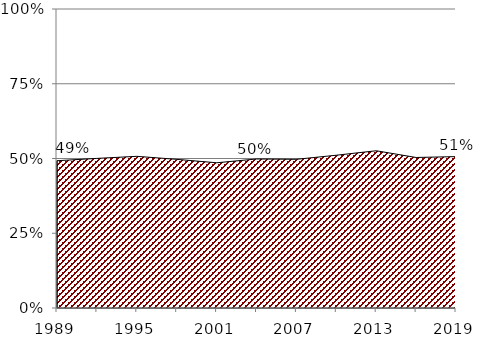
| Category | All workers, aged 25-64 |
|---|---|
| 1989.0 | 0.493 |
| 1992.0 | 0.5 |
| 1995.0 | 0.507 |
| 1998.0 | 0.497 |
| 2001.0 | 0.486 |
| 2004.0 | 0.498 |
| 2007.0 | 0.497 |
| 2010.0 | 0.511 |
| 2013.0 | 0.526 |
| 2016.0 | 0.503 |
| 2019.0 | 0.506 |